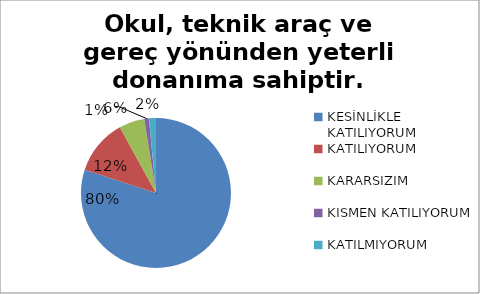
| Category | Okul, teknik araç ve gereç yönünden yeterli donanıma sahiptir. |
|---|---|
| KESİNLİKLE KATILIYORUM | 160 |
| KATILIYORUM | 24 |
| KARARSIZIM | 11 |
| KISMEN KATILIYORUM | 2 |
| KATILMIYORUM | 3 |